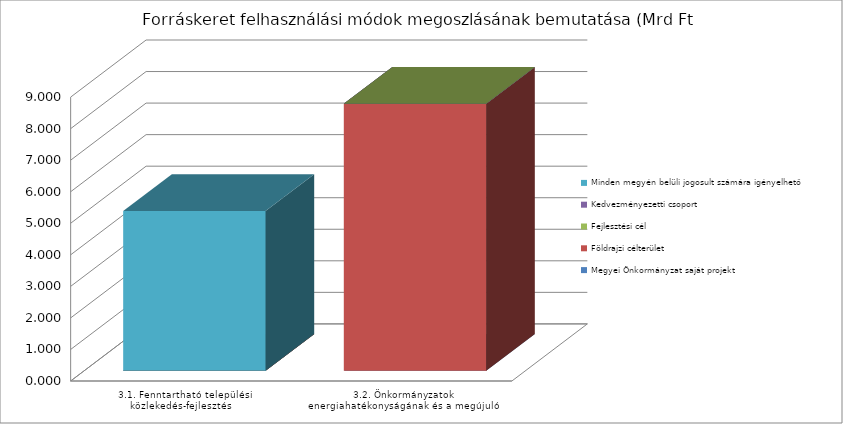
| Category | Megyei Önkormányzat saját projekt | Földrajzi célterület  | Fejlesztési cél  | Kedvezményezetti csoport | Minden megyén belüli jogosult számára igényelhető |
|---|---|---|---|---|---|
|  3.1. Fenntartható települési közlekedés-fejlesztés  | 0 | 0 | 0 | 0 | 5.069 |
|  3.2. Önkormányzatok energiahatékonyságának és a megújuló energia-felhasználás arányának növelése  | 0 | 8.466 | 0 | 0 | 0 |